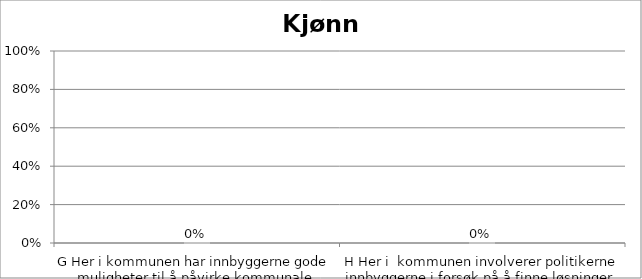
| Category | Series 0 |
|---|---|
| G Her i kommunen har innbyggerne gode muligheter til å påvirke kommunale beslutninger som engasjerer dem. | 0 |
| H Her i  kommunen involverer politikerne innbyggerne i forsøk på å finne løsninger på lokale problemer | 0 |